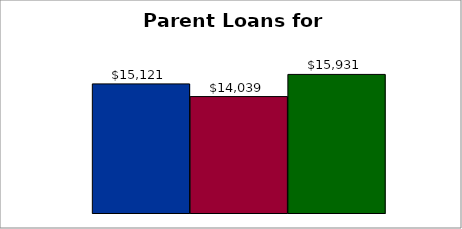
| Category | 50 states and D.C. | SREB states | State |
|---|---|---|---|
| 0 | 15121.493 | 14039.229 | 15930.787 |